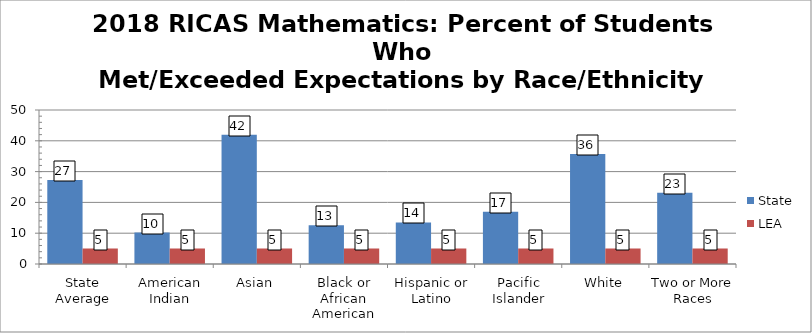
| Category | State | LEA |
|---|---|---|
| State Average | 27.3 | 5 |
| American Indian | 10.2 | 5 |
| Asian | 42 | 5 |
| Black or African American | 12.6 | 5 |
| Hispanic or Latino | 13.5 | 5 |
| Pacific Islander | 17 | 5 |
| White | 35.7 | 5 |
| Two or More Races | 23.1 | 5 |